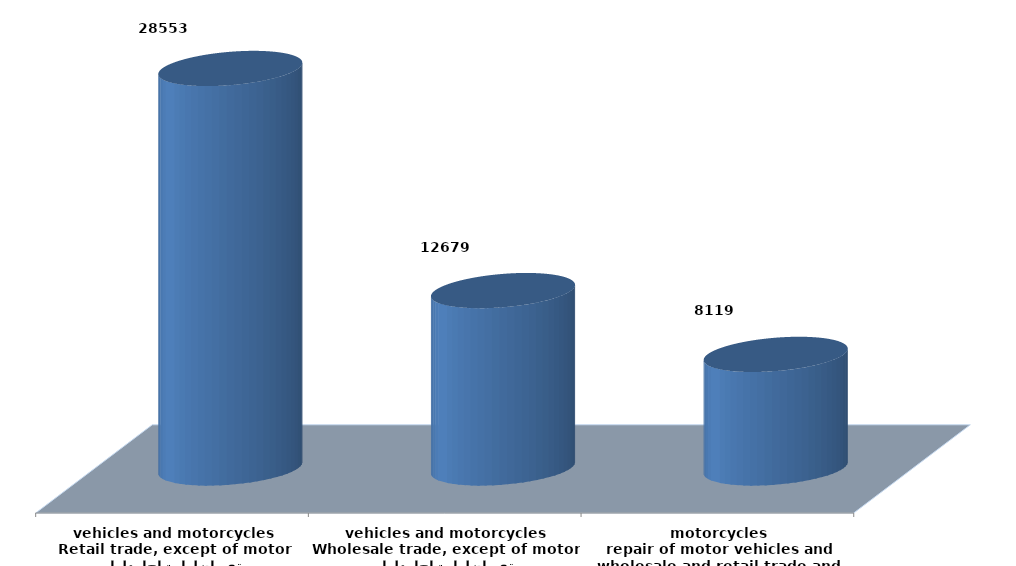
| Category | Series 0 |
|---|---|
| تجارة الجملة والتجزئة ،واصلاح المركبات ذات المحركات والدراجات النارية
wholesale and retail trade and repair of motor vehicles and motorcycles | 8119343 |
| تجارة الجملة ، باستثناء المركبات ذات المحركات والدراجات النارية
Wholesale trade, except of motor vehicles and motorcycles | 12679387 |
| تجارة التجزئة،باستثناء المركبات ذات المحركات والدراجات النارية
Retail trade, except of motor vehicles and motorcycles | 28552814 |